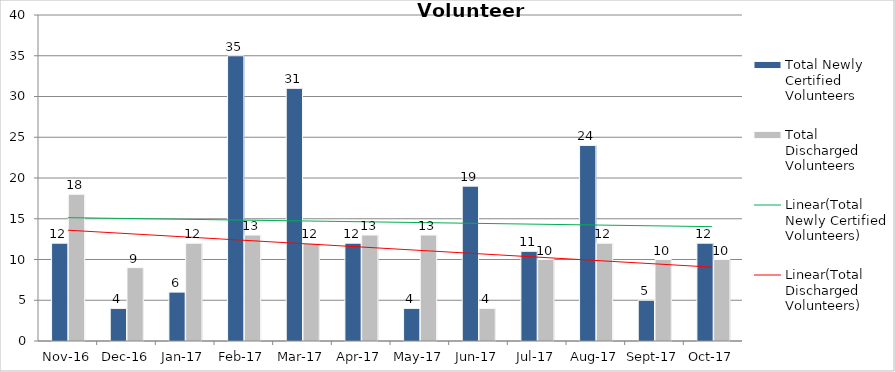
| Category | Total Newly Certified Volunteers | Total Discharged Volunteers |
|---|---|---|
| 2016-11-01 | 12 | 18 |
| 2016-12-01 | 4 | 9 |
| 2017-01-01 | 6 | 12 |
| 2017-02-01 | 35 | 13 |
| 2017-03-01 | 31 | 12 |
| 2017-04-01 | 12 | 13 |
| 2017-05-01 | 4 | 13 |
| 2017-06-01 | 19 | 4 |
| 2017-07-01 | 11 | 10 |
| 2017-08-01 | 24 | 12 |
| 2017-09-01 | 5 | 10 |
| 2017-10-01 | 12 | 10 |